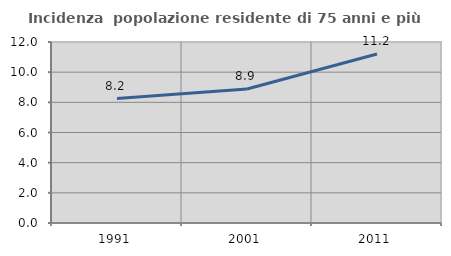
| Category | Incidenza  popolazione residente di 75 anni e più |
|---|---|
| 1991.0 | 8.249 |
| 2001.0 | 8.884 |
| 2011.0 | 11.209 |